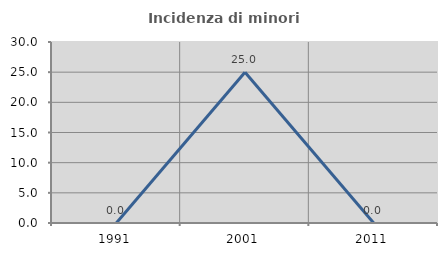
| Category | Incidenza di minori stranieri |
|---|---|
| 1991.0 | 0 |
| 2001.0 | 25 |
| 2011.0 | 0 |